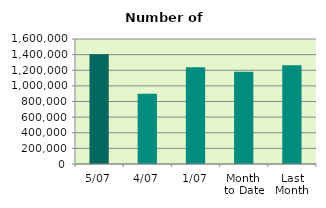
| Category | Series 0 |
|---|---|
| 5/07 | 1405456 |
| 4/07 | 898574 |
| 1/07 | 1238454 |
| Month 
to Date | 1180828 |
| Last
Month | 1263143.455 |